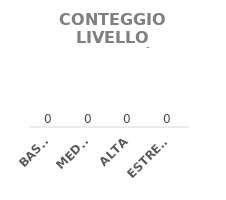
| Category | QT.À |
|---|---|
| BASSA | 0 |
| MEDIA | 0 |
| ALTA | 0 |
| ESTREMA | 0 |